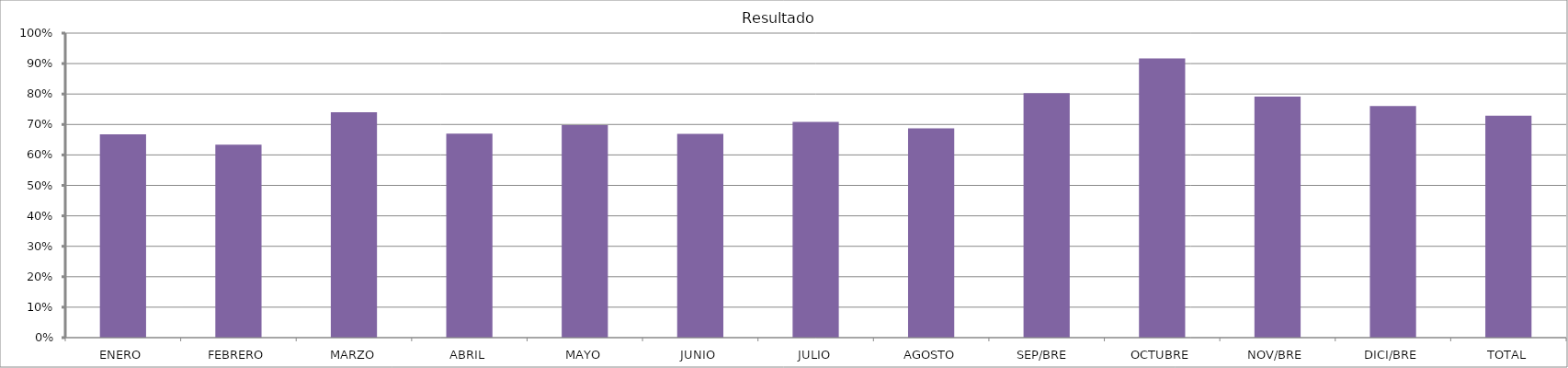
| Category | Resultado  |
|---|---|
| ENERO | 0.668 |
| FEBRERO | 0.633 |
| MARZO | 0.74 |
| ABRIL | 0.67 |
| MAYO | 0.698 |
| JUNIO | 0.669 |
| JULIO | 0.709 |
| AGOSTO | 0.687 |
| SEP/BRE  | 0.803 |
| OCTUBRE | 0.917 |
| NOV/BRE | 0.791 |
| DICI/BRE | 0.761 |
| TOTAL | 0.729 |